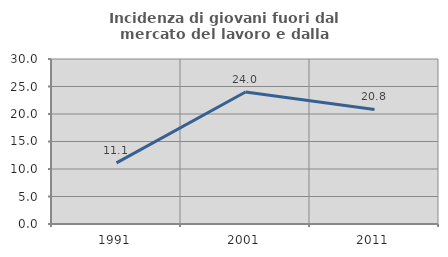
| Category | Incidenza di giovani fuori dal mercato del lavoro e dalla formazione  |
|---|---|
| 1991.0 | 11.111 |
| 2001.0 | 24 |
| 2011.0 | 20.833 |